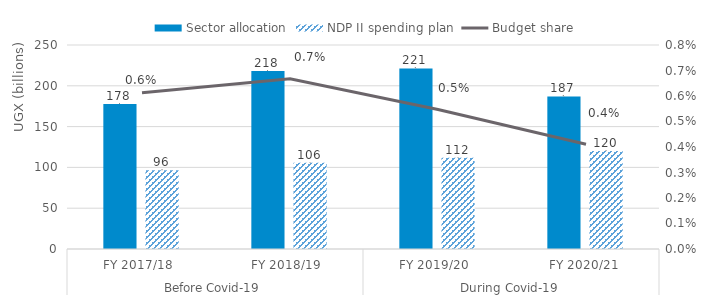
| Category | Sector allocation | NDP II spending plan |
|---|---|---|
| 0 | 177.81 | 96.388 |
| 1 | 218.22 | 105.676 |
| 2 | 221.35 | 111.769 |
| 3 | 187 | 119.992 |